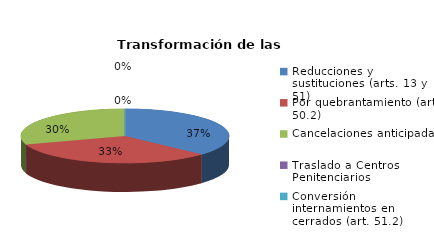
| Category | Series 0 |
|---|---|
| Reducciones y sustituciones (arts. 13 y 51) | 66 |
| Por quebrantamiento (art. 50.2) | 59 |
| Cancelaciones anticipadas | 54 |
| Traslado a Centros Penitenciarios | 0 |
| Conversión internamientos en cerrados (art. 51.2) | 0 |